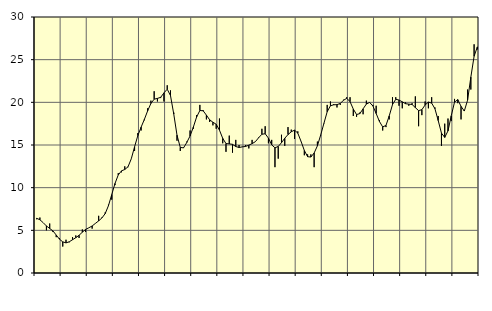
| Category | Piggar | Series 1 |
|---|---|---|
| nan | 6.3 | 6.41 |
| 87.0 | 6.5 | 6.24 |
| 87.0 | 5.9 | 5.9 |
| 87.0 | 5 | 5.51 |
| nan | 5.8 | 5.22 |
| 88.0 | 4.8 | 4.93 |
| 88.0 | 4.2 | 4.45 |
| 88.0 | 4.1 | 3.96 |
| nan | 3.1 | 3.65 |
| 89.0 | 3.9 | 3.53 |
| 89.0 | 3.6 | 3.66 |
| 89.0 | 4.2 | 3.9 |
| nan | 4.4 | 4.14 |
| 90.0 | 4.1 | 4.42 |
| 90.0 | 5.1 | 4.78 |
| 90.0 | 4.8 | 5.11 |
| nan | 5.3 | 5.3 |
| 91.0 | 5.2 | 5.51 |
| 91.0 | 5.8 | 5.81 |
| 91.0 | 6.7 | 6.11 |
| nan | 6.5 | 6.45 |
| 92.0 | 7.1 | 6.96 |
| 92.0 | 8 | 7.89 |
| 92.0 | 8.6 | 9.18 |
| nan | 10.3 | 10.49 |
| 93.0 | 11.7 | 11.49 |
| 93.0 | 11.8 | 11.97 |
| 93.0 | 12.5 | 12.13 |
| nan | 12.4 | 12.45 |
| 94.0 | 13.4 | 13.39 |
| 94.0 | 14.3 | 14.79 |
| 94.0 | 16.4 | 16.1 |
| nan | 16.7 | 17.09 |
| 95.0 | 17.9 | 18 |
| 95.0 | 19.3 | 19 |
| 95.0 | 20.2 | 19.87 |
| nan | 21.3 | 20.37 |
| 96.0 | 20.1 | 20.46 |
| 96.0 | 20.5 | 20.59 |
| 96.0 | 20.1 | 21.11 |
| nan | 22 | 21.54 |
| 97.0 | 21.4 | 20.79 |
| 97.0 | 18.8 | 18.63 |
| 97.0 | 15.5 | 16.15 |
| nan | 14.3 | 14.72 |
| 98.0 | 14.7 | 14.66 |
| 98.0 | 15.4 | 15.3 |
| 98.0 | 16.7 | 16.06 |
| nan | 16.9 | 17.09 |
| 99.0 | 18.5 | 18.28 |
| 99.0 | 19.7 | 19.04 |
| 99.0 | 19.1 | 19.01 |
| nan | 18 | 18.5 |
| 0.0 | 17.7 | 17.95 |
| 0.0 | 17.3 | 17.67 |
| 0.0 | 16.9 | 17.43 |
| nan | 18.1 | 16.74 |
| 1.0 | 15.2 | 15.78 |
| 1.0 | 14.2 | 15.17 |
| 1.0 | 16.1 | 15.13 |
| nan | 14.1 | 15.08 |
| 2.0 | 15.6 | 14.82 |
| 2.0 | 15 | 14.71 |
| 2.0 | 14.8 | 14.78 |
| nan | 15 | 14.83 |
| 3.0 | 14.6 | 14.98 |
| 3.0 | 15.6 | 15.16 |
| 3.0 | 15.4 | 15.39 |
| nan | 15.9 | 15.85 |
| 4.0 | 16.9 | 16.26 |
| 4.0 | 17.2 | 16.32 |
| 4.0 | 15.2 | 15.81 |
| nan | 15.6 | 15.02 |
| 5.0 | 12.4 | 14.67 |
| 5.0 | 13.4 | 14.83 |
| 5.0 | 16.2 | 15.27 |
| nan | 14.9 | 15.79 |
| 6.0 | 17.1 | 16.22 |
| 6.0 | 16.8 | 16.55 |
| 6.0 | 15.7 | 16.74 |
| nan | 16.6 | 16.39 |
| 7.0 | 15.4 | 15.42 |
| 7.0 | 13.8 | 14.36 |
| 7.0 | 13.9 | 13.63 |
| nan | 13.9 | 13.59 |
| 8.0 | 12.4 | 14.06 |
| 8.0 | 15.4 | 14.9 |
| 8.0 | 16.1 | 16.16 |
| nan | 17.5 | 17.54 |
| 9.0 | 19.7 | 18.9 |
| 9.0 | 20.1 | 19.6 |
| 9.0 | 19.8 | 19.71 |
| nan | 19.4 | 19.73 |
| 10.0 | 19.7 | 19.87 |
| 10.0 | 20.3 | 20.24 |
| 10.0 | 20.6 | 20.47 |
| nan | 20.6 | 20.08 |
| 11.0 | 18.4 | 19.21 |
| 11.0 | 18.3 | 18.57 |
| 11.0 | 18.8 | 18.68 |
| nan | 18.6 | 19.24 |
| 12.0 | 20.2 | 19.8 |
| 12.0 | 20 | 19.99 |
| 12.0 | 19.7 | 19.57 |
| nan | 19.6 | 18.69 |
| 13.0 | 17.9 | 17.76 |
| 13.0 | 16.7 | 17.12 |
| 13.0 | 17.1 | 17.29 |
| nan | 18 | 18.41 |
| 14.0 | 20.6 | 19.73 |
| 14.0 | 20.6 | 20.36 |
| 14.0 | 19.6 | 20.27 |
| nan | 19.3 | 20.06 |
| 15.0 | 20 | 19.84 |
| 15.0 | 19.6 | 19.79 |
| 15.0 | 19.9 | 19.75 |
| nan | 20.7 | 19.38 |
| 16.0 | 17.2 | 19.03 |
| 16.0 | 18.5 | 19.14 |
| 16.0 | 20.1 | 19.69 |
| nan | 19.3 | 20.03 |
| 17.0 | 20.6 | 19.91 |
| 17.0 | 19.4 | 19.25 |
| 17.0 | 18.4 | 17.87 |
| nan | 14.9 | 16.39 |
| 18.0 | 17.5 | 15.89 |
| 18.0 | 18.1 | 16.65 |
| 18.0 | 17.8 | 18.42 |
| nan | 20.4 | 20.02 |
| 19.0 | 19.9 | 20.32 |
| 19.0 | 18 | 19.53 |
| 19.0 | 19.1 | 18.98 |
| nan | 21.5 | 20.25 |
| 20.0 | 21.5 | 22.95 |
| 20.0 | 26.8 | 25.4 |
| 20.0 | 26.2 | 26.5 |